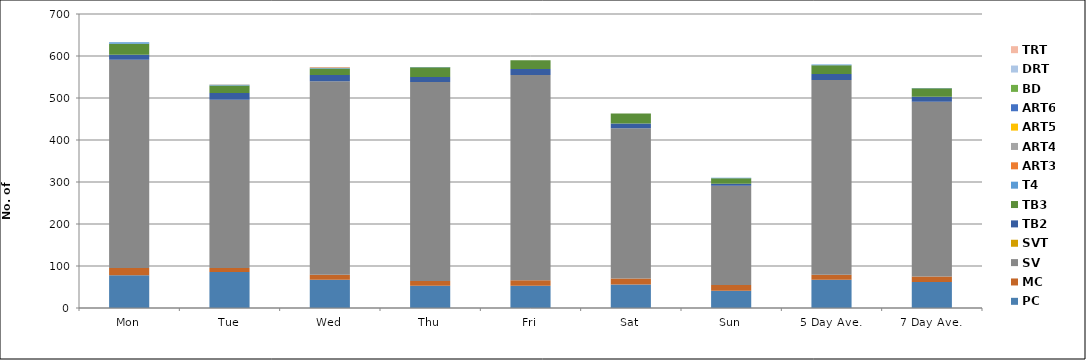
| Category | PC | MC | SV | SVT | TB2 | TB3 | T4 | ART3 | ART4 | ART5 | ART6 | BD | DRT | TRT |
|---|---|---|---|---|---|---|---|---|---|---|---|---|---|---|
| Mon | 78 | 17 | 496 | 0 | 12 | 26 | 4 | 0 | 0 | 0 | 0 | 0 | 0 | 0 |
| Tue | 86 | 9 | 401 | 0 | 16 | 18 | 1 | 0 | 1 | 0 | 0 | 0 | 0 | 0 |
| Wed | 67 | 12 | 461 | 0 | 15 | 15 | 2 | 1 | 0 | 0 | 0 | 0 | 0 | 0 |
| Thu | 53 | 11 | 474 | 0 | 12 | 23 | 1 | 0 | 0 | 0 | 0 | 0 | 0 | 0 |
| Fri | 53 | 13 | 489 | 0 | 14 | 21 | 0 | 0 | 0 | 0 | 0 | 0 | 0 | 0 |
| Sat | 56 | 14 | 358 | 0 | 11 | 24 | 0 | 0 | 0 | 0 | 0 | 0 | 0 | 0 |
| Sun | 41 | 14 | 236 | 0 | 5 | 13 | 1 | 0 | 0 | 0 | 0 | 0 | 0 | 0 |
| 5 Day Ave. | 67 | 12 | 464 | 0 | 14 | 21 | 2 | 0 | 0 | 0 | 0 | 0 | 0 | 0 |
| 7 Day Ave. | 62 | 13 | 416 | 0 | 12 | 20 | 1 | 0 | 0 | 0 | 0 | 0 | 0 | 0 |